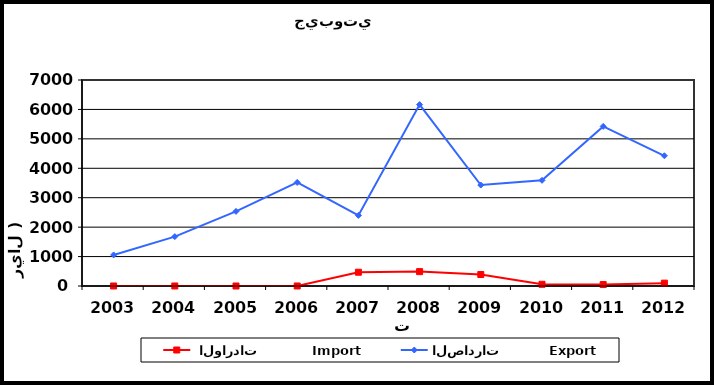
| Category |  الواردات           Import | الصادرات          Export |
|---|---|---|
| 2003.0 | 1 | 1055 |
| 2004.0 | 1 | 1677 |
| 2005.0 | 0 | 2536 |
| 2006.0 | 1 | 3519 |
| 2007.0 | 468 | 2399 |
| 2008.0 | 489 | 6163 |
| 2009.0 | 390 | 3430 |
| 2010.0 | 58 | 3591 |
| 2011.0 | 49 | 5424 |
| 2012.0 | 97 | 4425 |